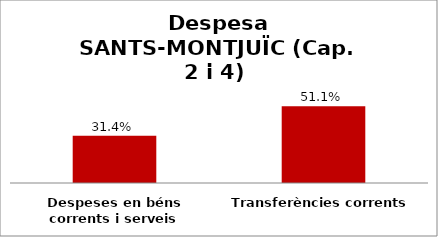
| Category | Series 0 |
|---|---|
| Despeses en béns corrents i serveis | 0.314 |
| Transferències corrents | 0.511 |